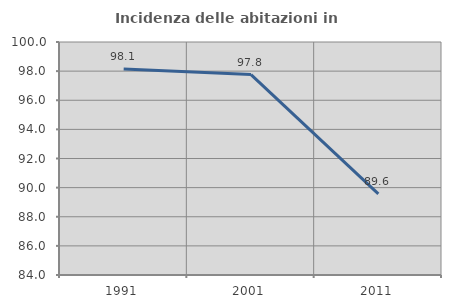
| Category | Incidenza delle abitazioni in proprietà  |
|---|---|
| 1991.0 | 98.148 |
| 2001.0 | 97.761 |
| 2011.0 | 89.565 |